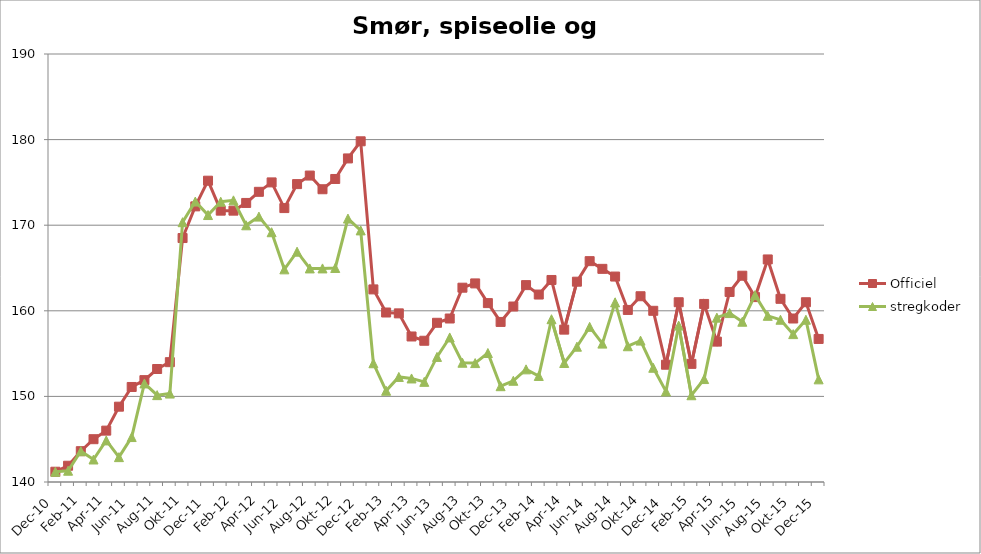
| Category | Officiel | stregkoder |
|---|---|---|
|  Dec-10 | 141.2 | 141.191 |
|  Jan-11 | 141.9 | 141.316 |
|  Feb-11 | 143.6 | 143.599 |
|  Mar-11 | 145 | 142.629 |
|  Apr-11 | 146 | 144.858 |
|  Maj-11 | 148.8 | 142.906 |
|  Jun-11 | 151.1 | 145.251 |
|  Jul-11 | 151.9 | 151.514 |
|  Aug-11 | 153.2 | 150.148 |
|  Sep-11 | 154 | 150.33 |
|  Okt-11 | 168.5 | 170.352 |
|  Nov-11 | 172.2 | 172.764 |
|  Dec-11 | 175.2 | 171.188 |
|  Jan-12 | 171.7 | 172.745 |
|  Feb-12 | 171.7 | 172.904 |
|  Mar-12 | 172.6 | 169.989 |
|  Apr-12 | 173.9 | 171.002 |
|  Maj-12 | 175 | 169.178 |
|  Jun-12 | 172 | 164.843 |
|  Jul-12 | 174.8 | 166.906 |
|  Aug-12 | 175.8 | 164.95 |
|  Sep-12 | 174.2 | 164.951 |
|  Okt-12 | 175.4 | 165.004 |
|  Nov-12 | 177.8 | 170.773 |
|  Dec-12 | 179.8 | 169.393 |
|  Jan-13 | 162.5 | 153.872 |
|  Feb-13 | 159.8 | 150.657 |
|  Mar-13 | 159.7 | 152.274 |
|  Apr-13 | 157 | 152.096 |
|  Maj-13 | 156.5 | 151.7 |
|  Jun-13 | 158.6 | 154.613 |
|  Jul-13 | 159.1 | 156.888 |
|  Aug-13 | 162.7 | 153.932 |
|  Sep-13 | 163.2 | 153.892 |
|  Okt-13 | 160.9 | 155.068 |
|  Nov-13 | 158.7 | 151.193 |
|  Dec-13 | 160.5 | 151.825 |
|  Jan-14 | 163 | 153.159 |
|  Feb-14 | 161.9 | 152.388 |
|  Mar-14 | 163.6 | 159.017 |
|  Apr-14 | 157.8 | 153.904 |
|  Maj-14 | 163.4 | 155.805 |
|  Jun-14 | 165.8 | 158.125 |
|  Jul-14 | 164.9 | 156.167 |
|  Aug-14 | 164 | 160.984 |
|  Sep-14 | 160.1 | 155.86 |
|  Okt-14 | 161.7 | 156.517 |
|  Nov-14 | 160 | 153.346 |
|  Dec-14 | 153.7 | 150.58 |
|  Jan-15 | 161 | 158.272 |
|  Feb-15 | 153.8 | 150.136 |
|  Mar-15 | 160.8 | 152.027 |
|  Apr-15 | 156.4 | 159.202 |
|  Maj-15 | 162.2 | 159.734 |
| Jun-15 | 164.1 | 158.722 |
| Jul-15 | 161.6 | 161.83 |
| Aug-15 | 166 | 159.413 |
| Sep-15 | 161.4 | 158.955 |
| Okt-15 | 159.1 | 157.275 |
| Nov-15 | 161 | 158.955 |
| Dec-15 | 156.712 | 151.992 |